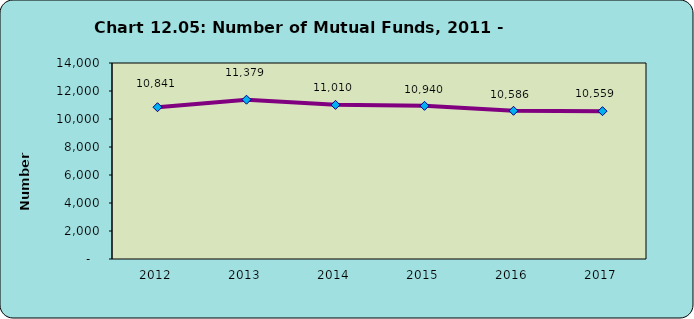
| Category | Series 0 |
|---|---|
| 2012.0 | 10841 |
| 2013.0 | 11379 |
| 2014.0 | 11010 |
| 2015.0 | 10940 |
| 2016.0 | 10586 |
| 2017.0 | 10559 |